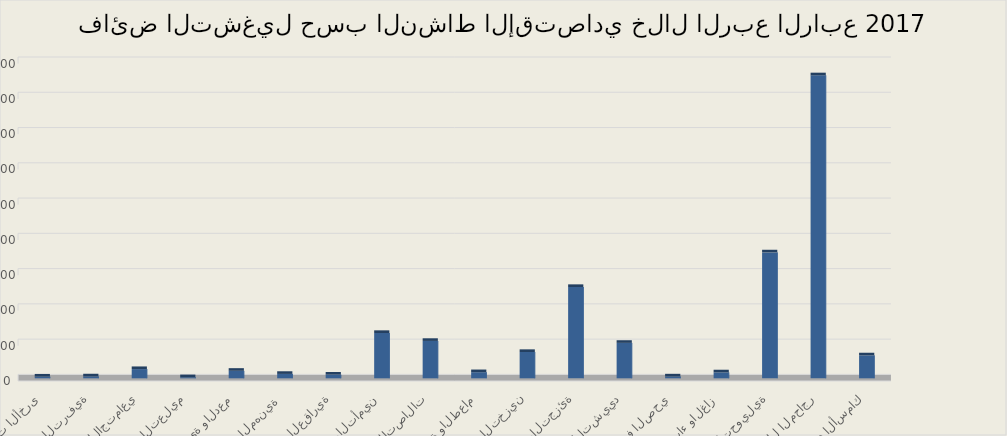
| Category | Series 0 |
|---|---|
| الزراعة والحراجة وصيد الأسماك | 13009992832 |
| التعدين واستغلال المحاجر | 171834883764 |
| الصناعة التحويلية | 71407449562 |
| توصيل الكهرباء والغاز  | 3372769248 |
| امدادات الماء والصرف الصحي | 1053611630 |
| التشييد | 20099066698 |
| تجارة الجملة والتجزئة | 51787985973 |
| النقل والتخزين | 14930628970 |
| الإقامة والطعام | 3481525881 |
| المعلومات والاتصالات | 21205272269 |
| أنشطة المال والتأمين | 25712181318 |
| الأنشطة العقارية | 2082518525 |
| الأنشطة المهنية  | 2500328878 |
| الخدمات الإدارية والدعم | 4258047719 |
| التعليم | 613136796 |
| الصحة والعمل الاجتماعي | 5237107497 |
| الفنون والترفية | 1084950375 |
| الخدمات الأخرى | 984822570 |